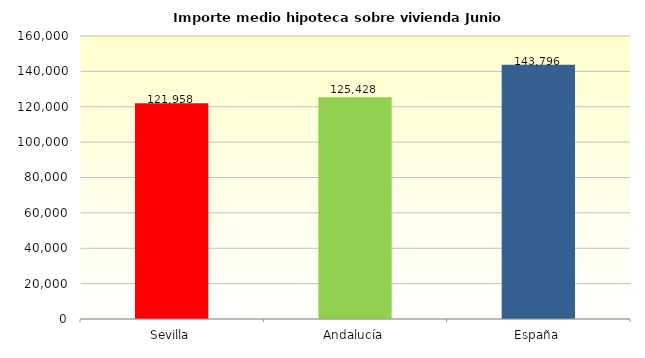
| Category | Series 2 |
|---|---|
| Sevilla | 121957.775 |
| Andalucía | 125427.801 |
| España | 143796.463 |